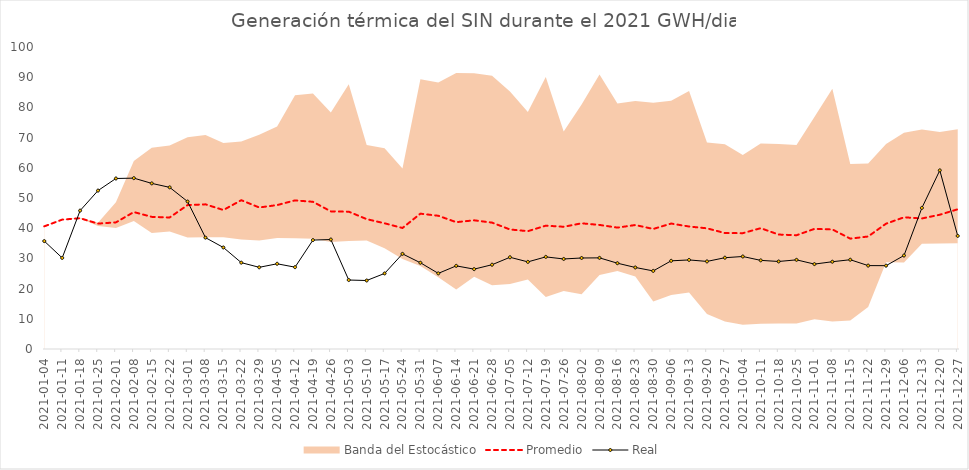
| Category | Promedio | Real |
|---|---|---|
| 2021-01-04 | 40.613 | 35.735 |
| 2021-01-11 | 42.839 | 30.158 |
| 2021-01-18 | 43.299 | 45.82 |
| 2021-01-25 | 41.521 | 52.452 |
| 2021-02-01 | 41.929 | 56.46 |
| 2021-02-08 | 45.346 | 56.579 |
| 2021-02-15 | 43.753 | 54.838 |
| 2021-02-22 | 43.547 | 53.525 |
| 2021-03-01 | 47.653 | 48.835 |
| 2021-03-08 | 47.899 | 36.877 |
| 2021-03-15 | 46.027 | 33.613 |
| 2021-03-22 | 49.274 | 28.591 |
| 2021-03-29 | 46.86 | 27.051 |
| 2021-04-05 | 47.657 | 28.217 |
| 2021-04-12 | 49.207 | 27.1 |
| 2021-04-19 | 48.743 | 36.069 |
| 2021-04-26 | 45.571 | 36.247 |
| 2021-05-03 | 45.477 | 22.842 |
| 2021-05-10 | 43.001 | 22.678 |
| 2021-05-17 | 41.624 | 25.019 |
| 2021-05-24 | 40.074 | 31.503 |
| 2021-05-31 | 44.814 | 28.558 |
| 2021-06-07 | 44.121 | 25.039 |
| 2021-06-14 | 41.994 | 27.526 |
| 2021-06-21 | 42.611 | 26.445 |
| 2021-06-28 | 41.847 | 27.906 |
| 2021-07-05 | 39.583 | 30.374 |
| 2021-07-12 | 39.014 | 28.844 |
| 2021-07-19 | 40.839 | 30.5 |
| 2021-07-26 | 40.476 | 29.814 |
| 2021-08-02 | 41.616 | 30.135 |
| 2021-08-09 | 41.083 | 30.175 |
| 2021-08-16 | 40.193 | 28.413 |
| 2021-08-23 | 41.051 | 26.996 |
| 2021-08-30 | 39.75 | 25.859 |
| 2021-09-06 | 41.539 | 29.196 |
| 2021-09-13 | 40.561 | 29.494 |
| 2021-09-20 | 39.957 | 28.998 |
| 2021-09-27 | 38.397 | 30.23 |
| 2021-10-04 | 38.361 | 30.631 |
| 2021-10-11 | 40.006 | 29.348 |
| 2021-10-18 | 37.899 | 28.982 |
| 2021-10-25 | 37.673 | 29.518 |
| 2021-11-01 | 39.777 | 28.11 |
| 2021-11-08 | 39.59 | 28.9 |
| 2021-11-15 | 36.539 | 29.56 |
| 2021-11-22 | 37.259 | 27.615 |
| 2021-11-29 | 41.499 | 27.593 |
| 2021-12-06 | 43.606 | 30.956 |
| 2021-12-13 | 43.224 | 46.719 |
| 2021-12-20 | 44.464 | 59.151 |
| 2021-12-27 | 46.269 | 37.443 |